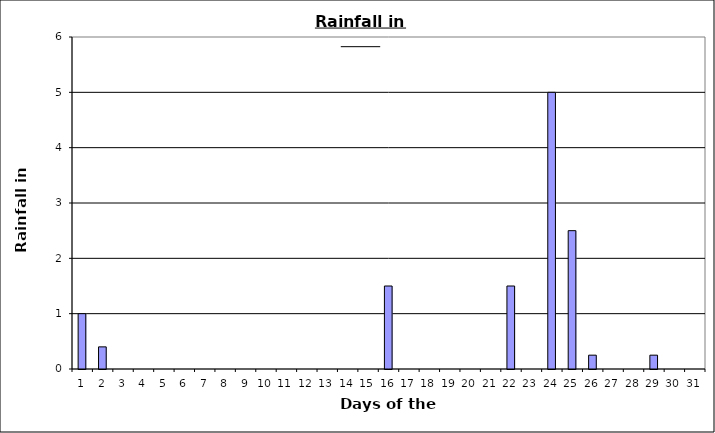
| Category | Series 0 |
|---|---|
| 0 | 1 |
| 1 | 0.4 |
| 2 | 0 |
| 3 | 0 |
| 4 | 0 |
| 5 | 0 |
| 6 | 0 |
| 7 | 0 |
| 8 | 0 |
| 9 | 0 |
| 10 | 0 |
| 11 | 0 |
| 12 | 0 |
| 13 | 0 |
| 14 | 0 |
| 15 | 1.5 |
| 16 | 0 |
| 17 | 0 |
| 18 | 0 |
| 19 | 0 |
| 20 | 0 |
| 21 | 1.5 |
| 22 | 0 |
| 23 | 5 |
| 24 | 2.5 |
| 25 | 0.25 |
| 26 | 0 |
| 27 | 0 |
| 28 | 0.25 |
| 29 | 0 |
| 30 | 0 |